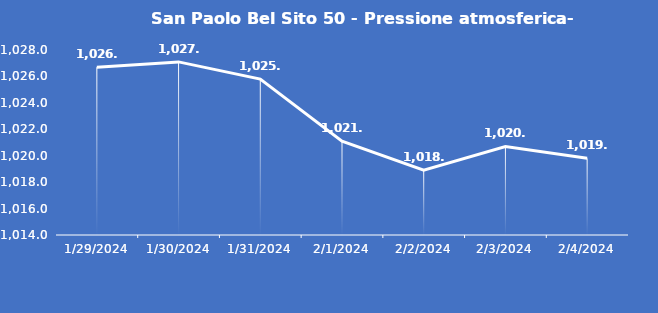
| Category | San Paolo Bel Sito 50 - Pressione atmosferica- Grezzo (hPa) |
|---|---|
| 1/29/24 | 1026.7 |
| 1/30/24 | 1027.1 |
| 1/31/24 | 1025.8 |
| 2/1/24 | 1021.1 |
| 2/2/24 | 1018.9 |
| 2/3/24 | 1020.7 |
| 2/4/24 | 1019.8 |